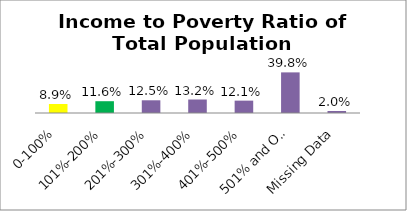
| Category | Percent |
|---|---|
| 0-100% | 0.089 |
| 101%-200% | 0.116 |
| 201%-300% | 0.125 |
| 301%-400% | 0.132 |
| 401%-500% | 0.121 |
| 501% and Over | 0.398 |
| Missing Data | 0.02 |